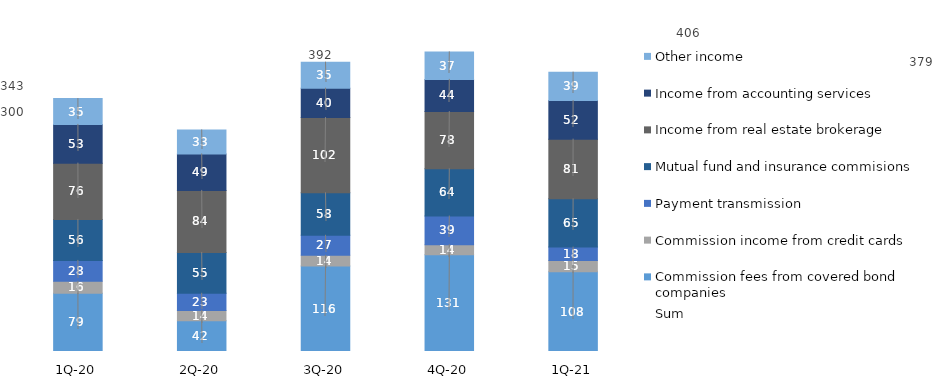
| Category | Commission fees from covered bond companies | Commission income from credit cards | Payment transmission | Mutual fund and insurance commisions | Income from real estate brokerage | Income from accounting services | Other income |
|---|---|---|---|---|---|---|---|
| 1Q-21 | 107.955 | 15.25 | 18.27 | 65.464 | 80.888 | 52.216 | 38.546 |
| 4Q-20 | 131.015 | 13.687 | 38.872 | 64.05 | 77.589 | 43.624 | 37.225 |
| 3Q-20 | 116.034 | 14.295 | 27.183 | 57.628 | 101.952 | 39.804 | 35.242 |
| 2Q-20 | 41.55 | 14.097 | 23.262 | 55.386 | 84.016 | 49.478 | 32.501 |
| 1Q-20 | 78.983 | 16.14 | 28.326 | 55.562 | 76.287 | 52.513 | 34.973 |